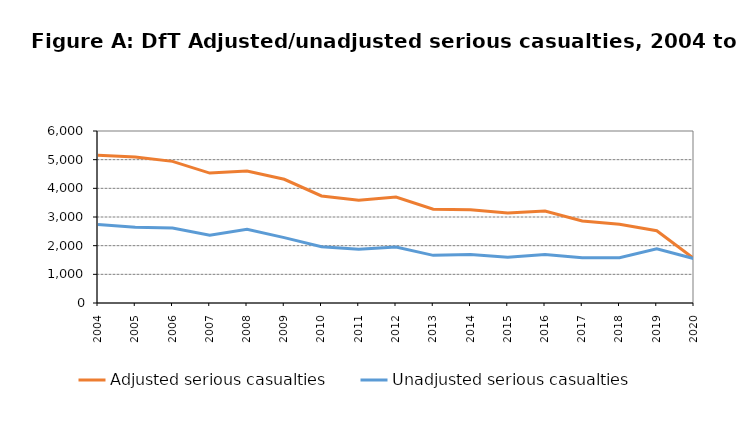
| Category | Adjusted serious casualties | Unadjusted serious casualties |
|---|---|---|
| 0 | 5155 | 2741 |
| 1 | 5091 | 2643 |
| 2 | 4941 | 2614 |
| 3 | 4531 | 2365 |
| 4 | 4606 | 2572 |
| 5 | 4316 | 2281 |
| 6 | 3734 | 1964 |
| 7 | 3584 | 1873 |
| 8 | 3694 | 1956 |
| 9 | 3269 | 1662 |
| 10 | 3257 | 1692 |
| 11 | 3143 | 1597 |
| 12 | 3208 | 1693 |
| 13 | 2858 | 1578 |
| 14 | 2750 | 1580 |
| 15 | 2519 | 1891 |
| 16 | 1547 | 1547 |